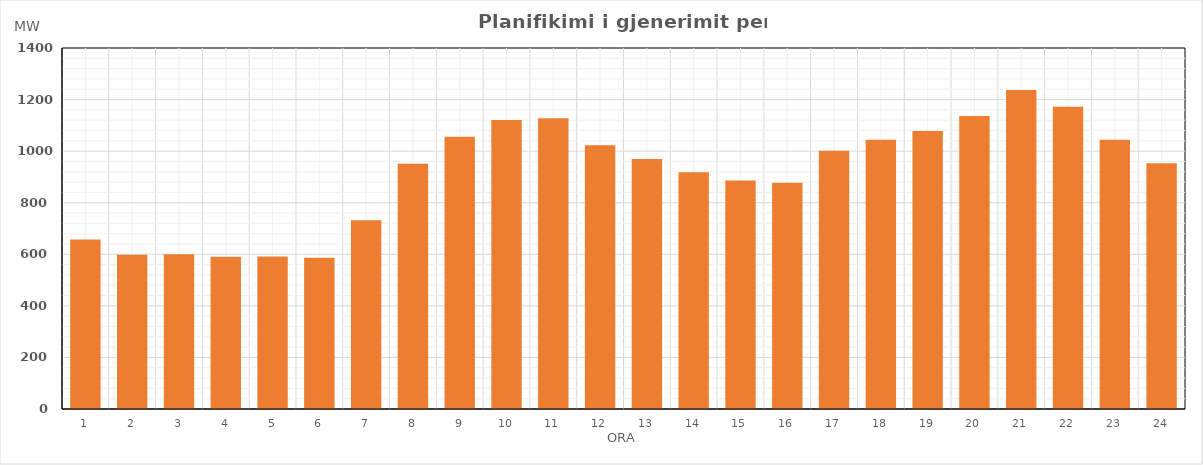
| Category | Max (MW) |
|---|---|
| 0 | 657.175 |
| 1 | 597.928 |
| 2 | 600.606 |
| 3 | 590.681 |
| 4 | 591.24 |
| 5 | 586.104 |
| 6 | 731.753 |
| 7 | 950.71 |
| 8 | 1055.839 |
| 9 | 1121.01 |
| 10 | 1127.491 |
| 11 | 1022.891 |
| 12 | 969.45 |
| 13 | 918.233 |
| 14 | 886.566 |
| 15 | 877.511 |
| 16 | 1001.889 |
| 17 | 1044.437 |
| 18 | 1077.857 |
| 19 | 1135.821 |
| 20 | 1237.563 |
| 21 | 1171.681 |
| 22 | 1044.178 |
| 23 | 952.753 |